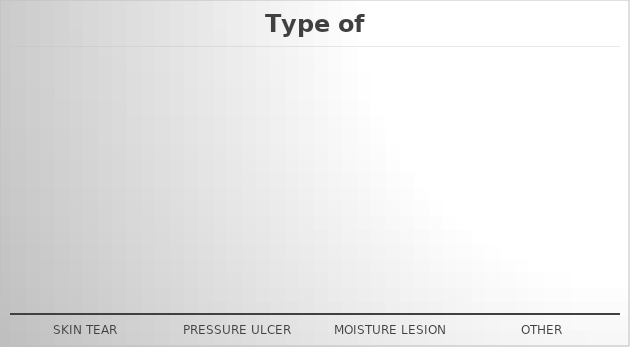
| Category | Series 0 |
|---|---|
| Skin Tear | 0 |
| Pressure Ulcer | 0 |
| Moisture Lesion | 0 |
| Other | 0 |